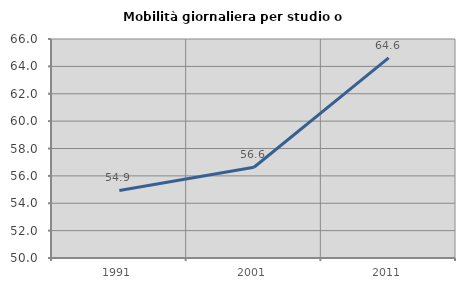
| Category | Mobilità giornaliera per studio o lavoro |
|---|---|
| 1991.0 | 54.938 |
| 2001.0 | 56.628 |
| 2011.0 | 64.625 |